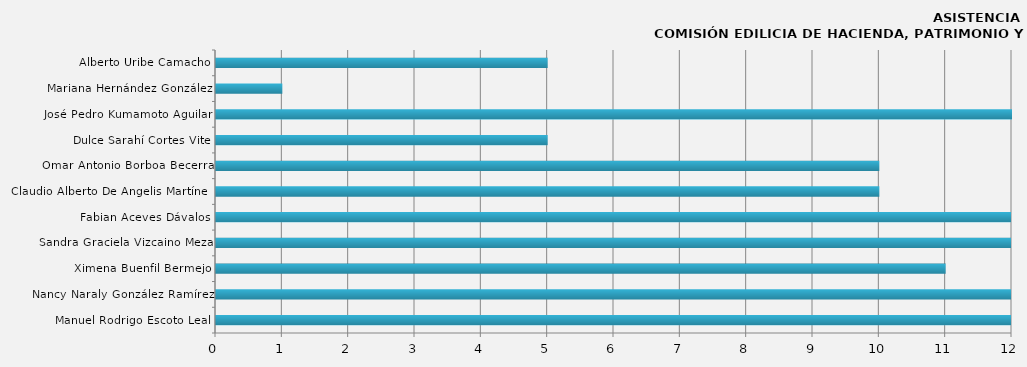
| Category | Manuel Rodrigo Escoto Leal |
|---|---|
| Manuel Rodrigo Escoto Leal | 14 |
| Nancy Naraly González Ramírez | 13 |
| Ximena Buenfil Bermejo | 11 |
| Sandra Graciela Vizcaino Meza | 14 |
| Fabian Aceves Dávalos | 14 |
| Claudio Alberto De Angelis Martínez | 10 |
| Omar Antonio Borboa Becerra | 10 |
| Dulce Sarahí Cortes Vite | 5 |
| José Pedro Kumamoto Aguilar | 12 |
| Mariana Hernández González | 1 |
| Alberto Uribe Camacho | 5 |